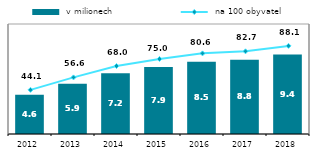
| Category |  v milionech |
|---|---|
| 2012.0 | 4.642 |
| 2013.0 | 5.95 |
| 2014.0 | 7.165 |
| 2015.0 | 7.918 |
| 2016.0 | 8.53 |
| 2017.0 | 8.777 |
| 2018.0 | 9.384 |